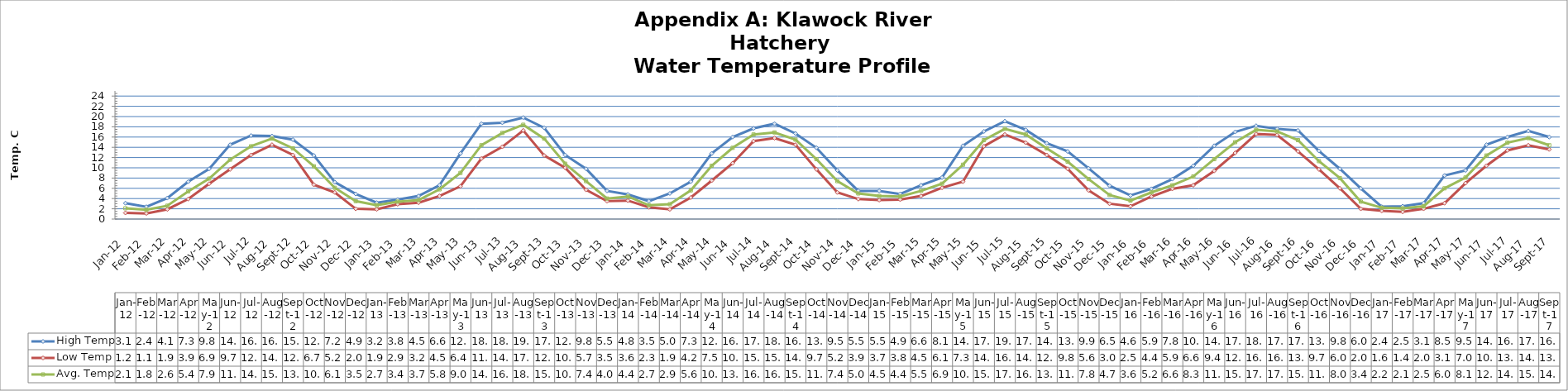
| Category | High Temp | Low Temp | Avg. Temp |
|---|---|---|---|
| 2012-01-01 | 3.1 | 1.2 | 2.1 |
| 2012-02-01 | 2.4 | 1.1 | 1.8 |
| 2012-03-01 | 4.1 | 1.9 | 2.6 |
| 2012-04-01 | 7.3 | 3.9 | 5.4 |
| 2012-05-01 | 9.8 | 6.9 | 7.9 |
| 2012-06-01 | 14.5 | 9.7 | 11.6 |
| 2012-07-01 | 16.3 | 12.5 | 14.2 |
| 2012-08-01 | 16.2 | 14.5 | 15.7 |
| 2012-09-01 | 15.5 | 12.5 | 13.8 |
| 2012-10-01 | 12.4 | 6.7 | 10.3 |
| 2012-11-01 | 7.2 | 5.2 | 6.1 |
| 2012-12-01 | 4.9 | 2 | 3.5 |
| 2013-01-01 | 3.2 | 1.9 | 2.7 |
| 2013-02-01 | 3.8 | 2.9 | 3.4 |
| 2013-03-01 | 4.5 | 3.2 | 3.7 |
| 2013-04-01 | 6.6 | 4.5 | 5.8 |
| 2013-05-01 | 12.8 | 6.4 | 9 |
| 2013-06-01 | 18.6 | 11.8 | 14.4 |
| 2013-07-01 | 18.8 | 14.1 | 16.8 |
| 2013-08-01 | 19.8 | 17.3 | 18.4 |
| 2013-09-01 | 17.8 | 12.4 | 15.7 |
| 2013-10-01 | 12.5 | 10 | 10.8 |
| 2013-11-01 | 9.8 | 5.7 | 7.4 |
| 2013-12-01 | 5.5 | 3.5 | 4 |
| 2014-01-01 | 4.8 | 3.6 | 4.4 |
| 2014-02-01 | 3.5 | 2.3 | 2.7 |
| 2014-03-01 | 5 | 1.9 | 2.9 |
| 2014-04-01 | 7.3 | 4.2 | 5.6 |
| 2014-05-01 | 12.8 | 7.5 | 10.4 |
| 2014-06-01 | 16 | 10.9 | 13.9 |
| 2014-07-01 | 17.7 | 15.2 | 16.5 |
| 2014-08-01 | 18.6 | 15.8 | 16.9 |
| 2014-09-01 | 16.7 | 14.5 | 15.5 |
| 2014-10-01 | 13.9 | 9.7 | 11.7 |
| 2014-11-01 | 9.5 | 5.2 | 7.4 |
| 2014-12-01 | 5.5 | 3.9 | 5 |
| 2015-01-01 | 5.5 | 3.7 | 4.5 |
| 2015-02-01 | 4.9 | 3.8 | 4.4 |
| 2015-03-01 | 6.6 | 4.5 | 5.5 |
| 2015-04-01 | 8.1 | 6.1 | 6.9 |
| 2015-05-01 | 14.3 | 7.3 | 10.6 |
| 2015-06-01 | 17.1 | 14.2 | 15.4 |
| 2015-07-01 | 19.1 | 16.5 | 17.6 |
| 2015-08-01 | 17.4 | 14.9 | 16.5 |
| 2015-09-01 | 14.8 | 12.5 | 13.8 |
| 2015-10-01 | 13.2 | 9.8 | 11.2 |
| 2015-11-01 | 9.9 | 5.6 | 7.8 |
| 2015-12-01 | 6.5 | 3 | 4.7 |
| 2016-01-01 | 4.6 | 2.5 | 3.6 |
| 2016-02-01 | 5.9 | 4.4 | 5.2 |
| 2016-03-01 | 7.8 | 5.9 | 6.6 |
| 2016-04-01 | 10.4 | 6.6 | 8.3 |
| 2016-05-01 | 14.3 | 9.4 | 11.7 |
| 2016-06-01 | 17 | 12.9 | 15 |
| 2016-07-01 | 18.2 | 16.6 | 17.4 |
| 2016-08-01 | 17.6 | 16.4 | 17.1 |
| 2016-09-01 | 17.3 | 13.2 | 15.4 |
| 2016-10-01 | 13.3 | 9.7 | 11.3 |
| 2016-11-01 | 9.8 | 6 | 8 |
| 2016-12-01 | 6 | 2 | 3.4 |
| 2017-01-01 | 2.4 | 1.6 | 2.2 |
| 2017-02-01 | 2.5 | 1.4 | 2.1 |
| 2017-03-01 | 3.1 | 2 | 2.5 |
| 2017-04-01 | 8.5 | 3.1 | 6 |
| 2017-05-01 | 9.5 | 7 | 8.1 |
| 2017-06-01 | 14.5 | 10.4 | 12.4 |
| 2017-07-01 | 16 | 13.4 | 14.9 |
| 2017-08-01 | 17.2 | 14.4 | 15.8 |
| 2017-09-01 | 16 | 13.6 | 14.4 |